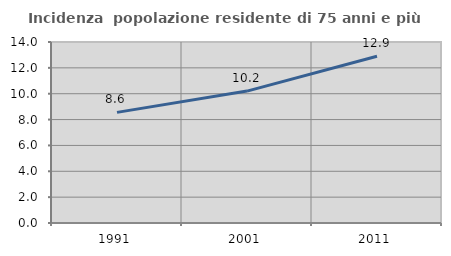
| Category | Incidenza  popolazione residente di 75 anni e più |
|---|---|
| 1991.0 | 8.556 |
| 2001.0 | 10.204 |
| 2011.0 | 12.895 |